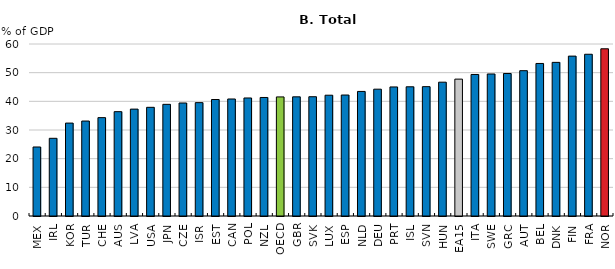
| Category | Total disbursements |
|---|---|
| MEX | 24.075 |
| IRL | 27.104 |
| KOR | 32.412 |
| TUR | 33.127 |
| CHE | 34.317 |
| AUS | 36.397 |
| LVA | 37.286 |
| USA | 37.914 |
| JPN | 38.951 |
| CZE | 39.42 |
| ISR | 39.547 |
| EST | 40.637 |
| CAN | 40.817 |
| POL | 41.171 |
| NZL | 41.343 |
| OECD | 41.54 |
| GBR | 41.57 |
| SVK | 41.607 |
| LUX | 42.137 |
| ESP | 42.201 |
| NLD | 43.453 |
| DEU | 44.239 |
| PRT | 45.022 |
| ISL | 45.076 |
| SVN | 45.125 |
| HUN | 46.683 |
| EA15 | 47.747 |
| ITA | 49.37 |
| SWE | 49.542 |
| GRC | 49.71 |
| AUT | 50.691 |
| BEL | 53.209 |
| DNK | 53.595 |
| FIN | 55.773 |
| FRA | 56.419 |
| NOR | 58.332 |